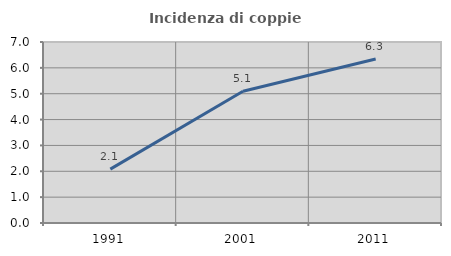
| Category | Incidenza di coppie miste |
|---|---|
| 1991.0 | 2.083 |
| 2001.0 | 5.093 |
| 2011.0 | 6.343 |